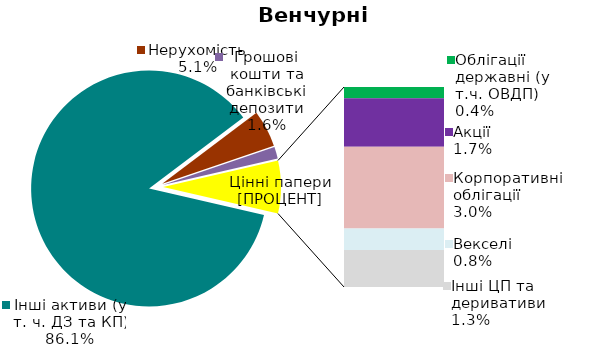
| Category | Series 0 |
|---|---|
| Інші активи (у т. ч. ДЗ та КП) | 0.861 |
| Нерухомість | 0.051 |
| Грошові кошти та банківські депозити | 0.016 |
| Банківські метали | 0 |
| Облігації державні (у т.ч. ОВДП) | 0.004 |
| Облігації місцевих позик | 0 |
| Акції | 0.017 |
| Корпоративні облігації | 0.03 |
| Векселі | 0.008 |
| Інші ЦП та деривативи | 0.013 |